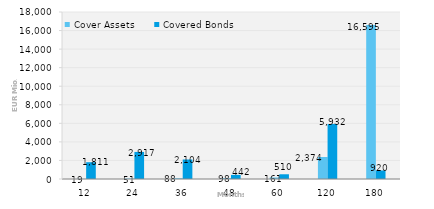
| Category | Cover Assets | Covered Bonds |
|---|---|---|
| 12.0 | 19.34 | 1811 |
| 24.0 | 51.35 | 2917.286 |
| 36.0 | 88.171 | 2103.5 |
| 48.0 | 97.994 | 441.5 |
| 60.0 | 160.673 | 510 |
| 120.0 | 2374.406 | 5931.516 |
| 180.0 | 16594.882 | 919.756 |